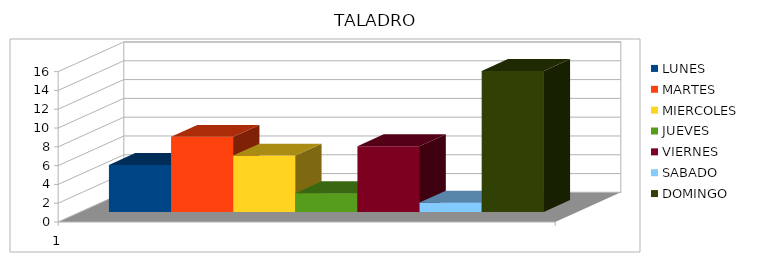
| Category | LUNES | MARTES | MIERCOLES | JUEVES | VIERNES | SABADO | DOMINGO |
|---|---|---|---|---|---|---|---|
| 0 | 5 | 8 | 6 | 2 | 7 | 1 | 15 |